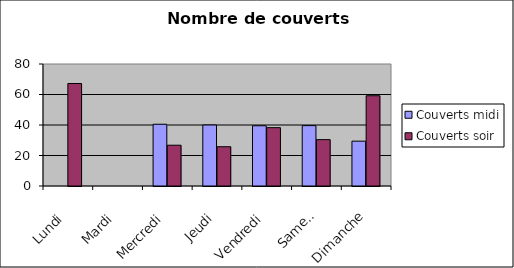
| Category | Couverts |
|---|---|
| Lundi | 67.2 |
| Mardi | 0 |
| Mercredi | 26.75 |
| Jeudi | 25.75 |
| Vendredi | 38.25 |
| Samedi | 30.4 |
| Dimanche | 59.2 |